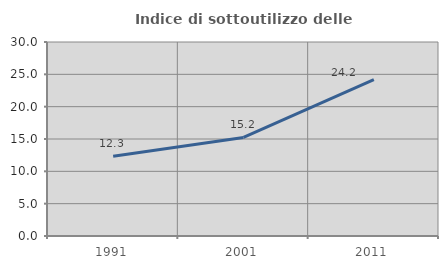
| Category | Indice di sottoutilizzo delle abitazioni  |
|---|---|
| 1991.0 | 12.32 |
| 2001.0 | 15.237 |
| 2011.0 | 24.185 |